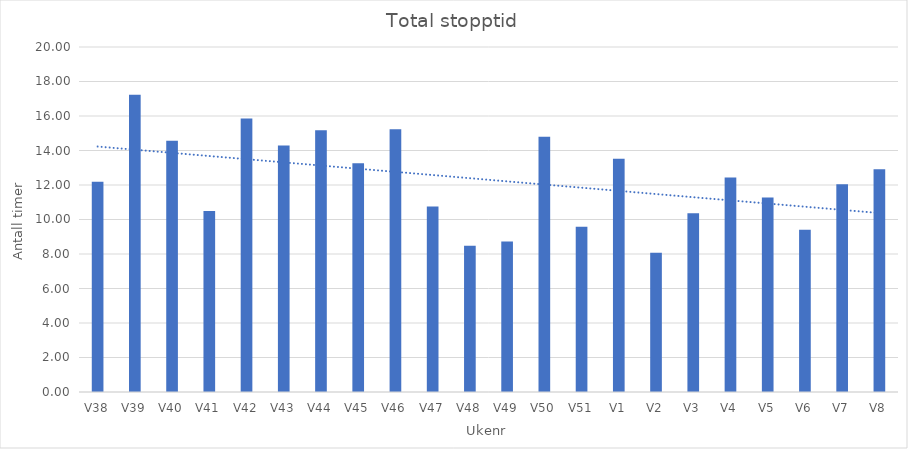
| Category | Total stopptid |
|---|---|
| V38 | 12.193 |
| V39 | 17.238 |
| V40 | 14.558 |
| V41 | 10.493 |
| V42 | 15.862 |
| V43 | 14.285 |
| V44 | 15.177 |
| V45 | 13.255 |
| V46 | 15.235 |
| V47 | 10.76 |
| V48 | 8.472 |
| V49 | 8.718 |
| V50 | 14.793 |
| V51 | 9.587 |
| V1 | 13.523 |
| V2 | 8.078 |
| V3 | 10.36 |
| V4 | 12.435 |
| V5 | 11.27 |
| V6 | 9.403 |
| V7 | 12.037 |
| V8 | 12.918 |